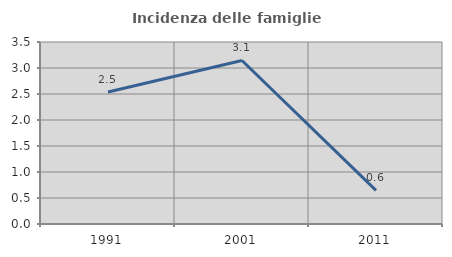
| Category | Incidenza delle famiglie numerose |
|---|---|
| 1991.0 | 2.538 |
| 2001.0 | 3.145 |
| 2011.0 | 0.645 |